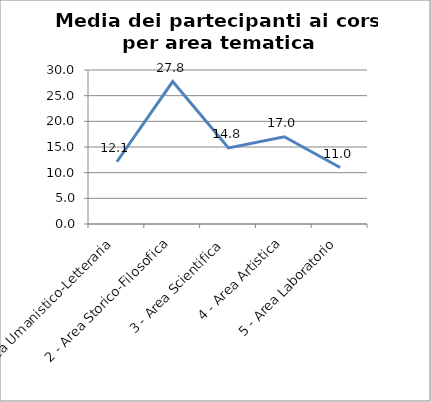
| Category | Media dei partecipanti ai corsi |
|---|---|
| 1 - Area Umanistico-Letteraria | 12.129 |
| 2 - Area Storico-Filosofica | 27.75 |
| 3 - Area Scientifica | 14.833 |
| 4 - Area Artistica | 17 |
| 5 - Area Laboratorio | 11 |